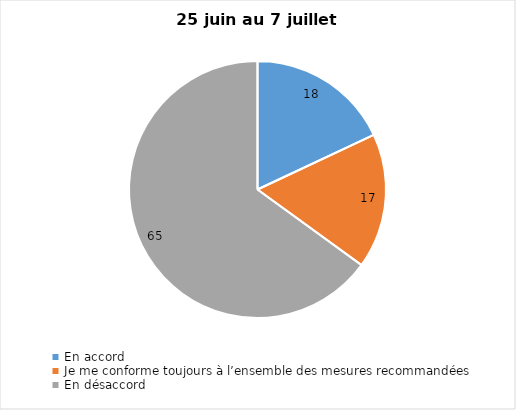
| Category | Series 0 |
|---|---|
| En accord | 18 |
| Je me conforme toujours à l’ensemble des mesures recommandées | 17 |
| En désaccord | 65 |